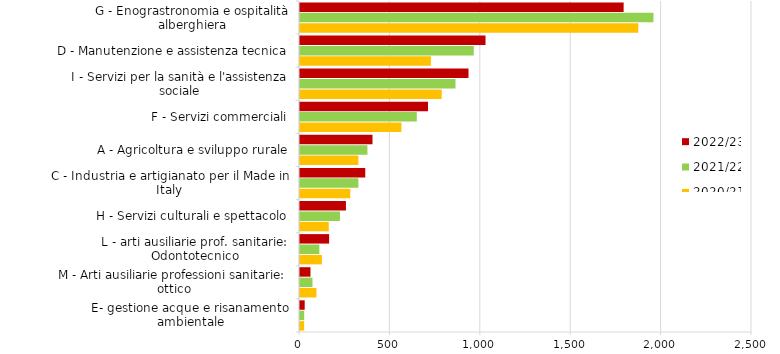
| Category | 2020/21 | 2021/22 | 2022/23 |
|---|---|---|---|
| E- gestione acque e risanamento ambientale | 23 | 23 | 26 |
| M - Arti ausiliarie professioni sanitarie: ottico | 91 | 69 | 58 |
| L - arti ausiliarie prof. sanitarie: Odontotecnico | 121 | 107 | 161 |
| H - Servizi culturali e spettacolo | 159 | 221 | 254 |
| C - Industria e artigianato per il Made in Italy  | 278 | 323 | 361 |
| A - Agricoltura e sviluppo rurale | 323 | 373 | 401 |
| F - Servizi commerciali | 561 | 646 | 708 |
| I - Servizi per la sanità e l'assistenza sociale | 784 | 860 | 932 |
| D - Manutenzione e assistenza tecnica | 724 | 961 | 1026 |
| G - Enograstronomia e ospitalità alberghiera | 1871 | 1955 | 1790 |